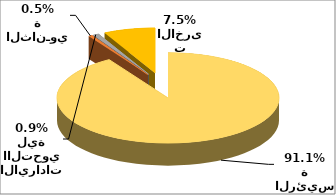
| Category | Series 0 |
|---|---|
| الايرادات الرئيسة | 7586743434 |
| الايـرادات الثانـوية | 44717868 |
| الايرادات االتحويلية | 72895452 |
| الايرادات الاخرى | 623033118 |